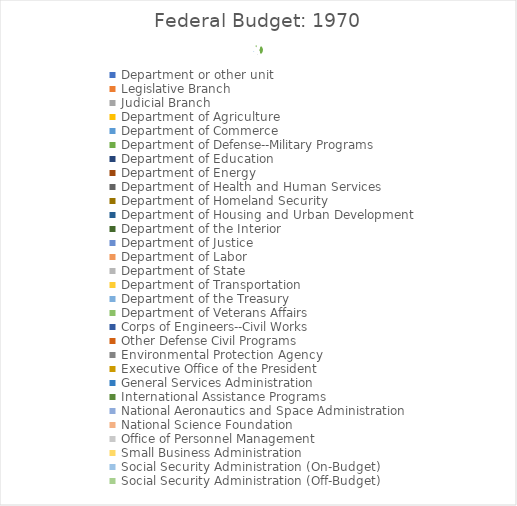
| Category | Series 0 |
|---|---|
| Department or other unit | 1970 |
| Legislative Branch | 353 |
| Judicial Branch | 133 |
| Department of Agriculture | 8412 |
| Department of Commerce | 778 |
| Department of Defense--Military Programs | 80123 |
| Department of Education | 4594 |
| Department of Energy | 2393 |
| Department of Health and Human Services | 17397 |
| Department of Homeland Security | 1089 |
| Department of Housing and Urban Development | 2432 |
| Department of the Interior | 1087 |
| Department of Justice | 537 |
| Department of Labor | 4976 |
| Department of State | 661 |
| Department of Transportation | 6136 |
| Department of the Treasury | 19070 |
| Department of Veterans Affairs | 8652 |
| Corps of Engineers--Civil Works | 1168 |
| Other Defense Civil Programs | 2974 |
| Environmental Protection Agency | 384 |
| Executive Office of the President | 29 |
| General Services Administration | 530 |
| International Assistance Programs | 2655 |
| National Aeronautics and Space Administration | 3752 |
| National Science Foundation | 464 |
| Office of Personnel Management | 2652 |
| Small Business Administration | 253 |
| Social Security Administration (On-Budget) | 458 |
| Social Security Administration (Off-Budget) | 29812 |